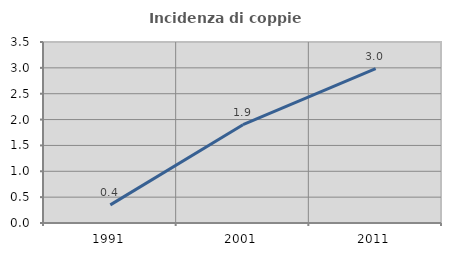
| Category | Incidenza di coppie miste |
|---|---|
| 1991.0 | 0.351 |
| 2001.0 | 1.901 |
| 2011.0 | 2.986 |